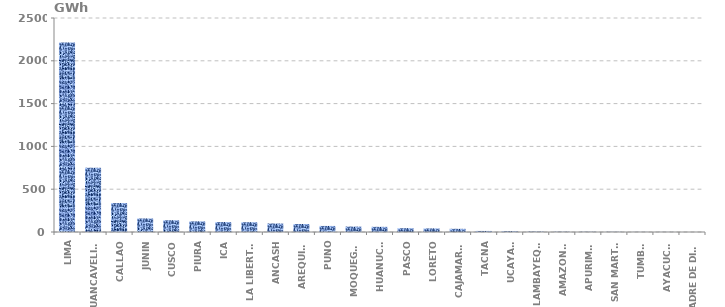
| Category | Series 0 |
|---|---|
| LIMA | 2214.583 |
| HUANCAVELICA | 752.031 |
| CALLAO | 338.309 |
| JUNIN | 158.176 |
| CUSCO | 137.109 |
| PIURA | 124.101 |
| ICA | 115.925 |
| LA LIBERTAD | 114.427 |
| ANCASH | 99.015 |
| AREQUIPA | 93.158 |
| PUNO | 70.756 |
| MOQUEGUA | 63.155 |
| HUANUCO | 60.319 |
| PASCO | 44.7 |
| LORETO | 41.929 |
| CAJAMARCA | 37.306 |
| TACNA | 12.31 |
| UCAYALI | 9.25 |
| LAMBAYEQUE | 5.003 |
| AMAZONAS | 3.358 |
| APURIMAC | 2.837 |
| SAN MARTÍN | 2.214 |
| TUMBES | 1.101 |
| AYACUCHO | 0.968 |
| MADRE DE DIOS | 0.2 |